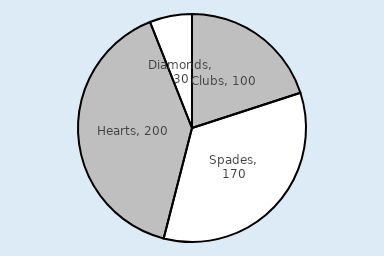
| Category | Series 0 |
|---|---|
| Clubs | 100 |
| Spades | 170 |
| Hearts | 200 |
| Diamonds | 30 |